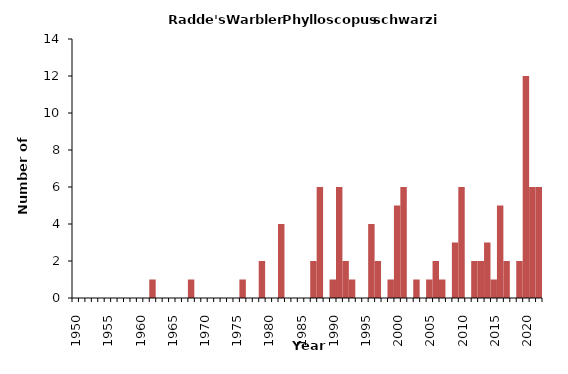
| Category | Series 1 |
|---|---|
| 1950.0 | 0 |
| 1951.0 | 0 |
| 1952.0 | 0 |
| 1953.0 | 0 |
| 1954.0 | 0 |
| 1955.0 | 0 |
| 1956.0 | 0 |
| 1957.0 | 0 |
| 1958.0 | 0 |
| 1959.0 | 0 |
| 1960.0 | 0 |
| 1961.0 | 0 |
| 1962.0 | 1 |
| 1963.0 | 0 |
| 1964.0 | 0 |
| 1965.0 | 0 |
| 1966.0 | 0 |
| 1967.0 | 0 |
| 1968.0 | 1 |
| 1969.0 | 0 |
| 1970.0 | 0 |
| 1971.0 | 0 |
| 1972.0 | 0 |
| 1973.0 | 0 |
| 1974.0 | 0 |
| 1975.0 | 0 |
| 1976.0 | 1 |
| 1977.0 | 0 |
| 1978.0 | 0 |
| 1979.0 | 2 |
| 1980.0 | 0 |
| 1981.0 | 0 |
| 1982.0 | 4 |
| 1983.0 | 0 |
| 1984.0 | 0 |
| 1985.0 | 0 |
| 1986.0 | 0 |
| 1987.0 | 2 |
| 1988.0 | 6 |
| 1989.0 | 0 |
| 1990.0 | 1 |
| 1991.0 | 6 |
| 1992.0 | 2 |
| 1993.0 | 1 |
| 1994.0 | 0 |
| 1995.0 | 0 |
| 1996.0 | 4 |
| 1997.0 | 2 |
| 1998.0 | 0 |
| 1999.0 | 1 |
| 2000.0 | 5 |
| 2001.0 | 6 |
| 2002.0 | 0 |
| 2003.0 | 1 |
| 2004.0 | 0 |
| 2005.0 | 1 |
| 2006.0 | 2 |
| 2007.0 | 1 |
| 2008.0 | 0 |
| 2009.0 | 3 |
| 2010.0 | 6 |
| 2011.0 | 0 |
| 2012.0 | 2 |
| 2013.0 | 2 |
| 2014.0 | 3 |
| 2015.0 | 1 |
| 2016.0 | 5 |
| 2017.0 | 2 |
| 2018.0 | 0 |
| 2019.0 | 2 |
| 2020.0 | 12 |
| 2021.0 | 6 |
| 2022.0 | 6 |